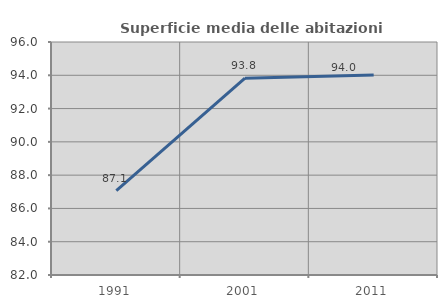
| Category | Superficie media delle abitazioni occupate |
|---|---|
| 1991.0 | 87.073 |
| 2001.0 | 93.829 |
| 2011.0 | 94.01 |